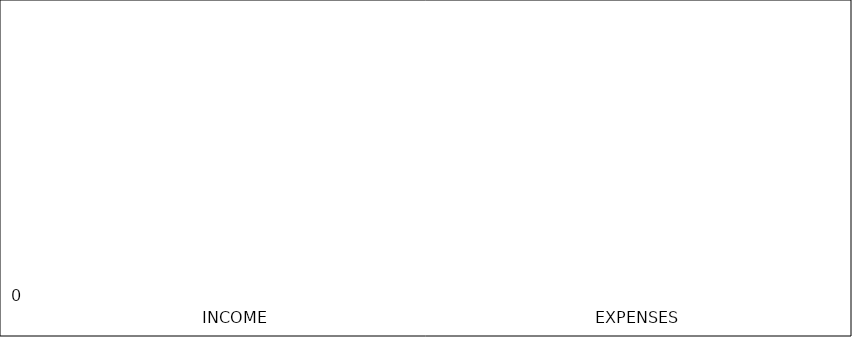
| Category | Series 0 |
|---|---|
| Income | 0 |
| Expenses | 0 |